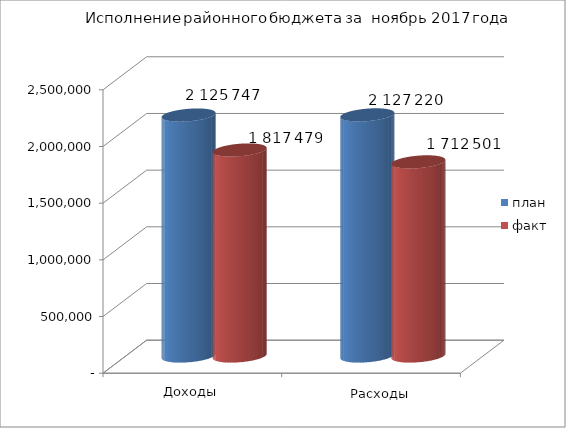
| Category | план | факт |
|---|---|---|
| 0 | 2125747 | 1817479 |
| 1 | 2127220 | 1712500.86 |